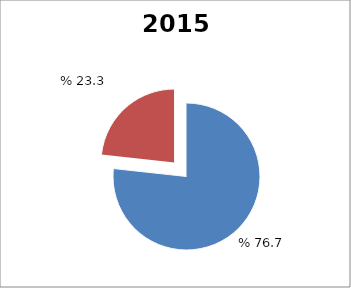
| Category | 2015 |
|---|---|
| Kudeaketa zuzenaren bidezko bilketa | 2453965.502 |
| Doikuntza fiskalak | 744464.29 |